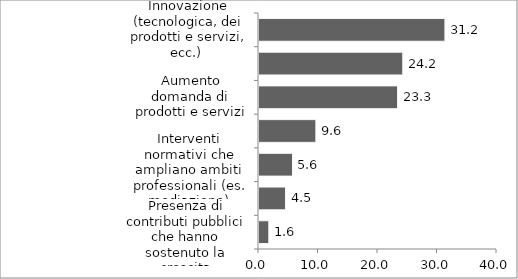
| Category | Totale |
|---|---|
| Presenza di contributi pubblici che hanno sostenuto la crescita | 1.65 |
| Diminuzione dei competitors | 4.464 |
| Interventi normativi che ampliano ambiti professionali (es. mediazione) | 5.628 |
| Aumento delle opportunità da ampliamento dei mercati | 9.558 |
| Aumento domanda di prodotti e servizi | 23.29 |
| Crescita dell’attenzione alla qualità da parte del mercato | 24.163 |
| Innovazione (tecnologica, dei prodotti e servizi, ecc.)  | 31.247 |